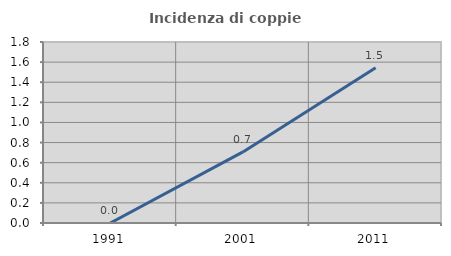
| Category | Incidenza di coppie miste |
|---|---|
| 1991.0 | 0 |
| 2001.0 | 0.707 |
| 2011.0 | 1.544 |